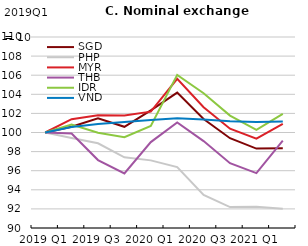
| Category | SGD | PHP | MYR | THB | IDR | VND |
|---|---|---|---|---|---|---|
| 2019 Q1 | 100 | 100 | 100 | 100 | 100 | 100 |
| 2019 Q2 | 100.605 | 99.431 | 101.397 | 99.9 | 100.831 | 100.586 |
| 2019 Q3 | 101.498 | 98.874 | 101.809 | 97.113 | 99.971 | 100.897 |
| 2019 Q4 | 100.595 | 97.407 | 101.793 | 95.72 | 99.515 | 101.093 |
| 2020 Q1 | 102.32 | 97.081 | 102.184 | 98.995 | 100.692 | 101.305 |
| 2020 Q2 | 104.18 | 96.381 | 105.621 | 101.05 | 106.037 | 101.491 |
| 2020 Q3 | 101.407 | 93.471 | 102.644 | 99.102 | 104.116 | 101.352 |
| 2020 Q4 | 99.4 | 92.186 | 100.399 | 96.789 | 101.772 | 101.184 |
| 2021 Q1 | 98.312 | 92.213 | 99.35 | 95.75 | 100.268 | 101.11 |
| 2021 Q2 | 98.361 | 92.023 | 100.906 | 99.157 | 101.958 | 101.156 |